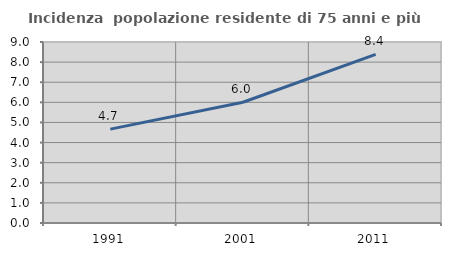
| Category | Incidenza  popolazione residente di 75 anni e più |
|---|---|
| 1991.0 | 4.669 |
| 2001.0 | 6.004 |
| 2011.0 | 8.386 |